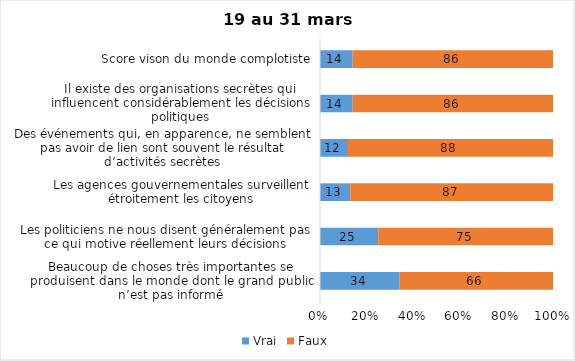
| Category | Vrai | Faux |
|---|---|---|
| Beaucoup de choses très importantes se produisent dans le monde dont le grand public n’est pas informé | 34 | 66 |
| Les politiciens ne nous disent généralement pas ce qui motive réellement leurs décisions | 25 | 75 |
| Les agences gouvernementales surveillent étroitement les citoyens | 13 | 87 |
| Des événements qui, en apparence, ne semblent pas avoir de lien sont souvent le résultat d’activités secrètes | 12 | 88 |
| Il existe des organisations secrètes qui influencent considérablement les décisions politiques | 14 | 86 |
| Score vison du monde complotiste | 14 | 86 |